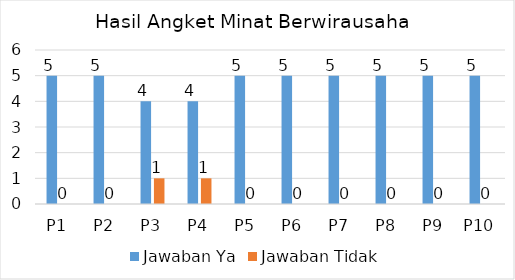
| Category | Jawaban Ya | Jawaban Tidak |
|---|---|---|
| P1 | 5 | 0 |
| P2 | 5 | 0 |
| P3 | 4 | 1 |
| P4 | 4 | 1 |
| P5 | 5 | 0 |
| P6 | 5 | 0 |
| P7 | 5 | 0 |
| P8 | 5 | 0 |
| P9 | 5 | 0 |
| P10 | 5 | 0 |